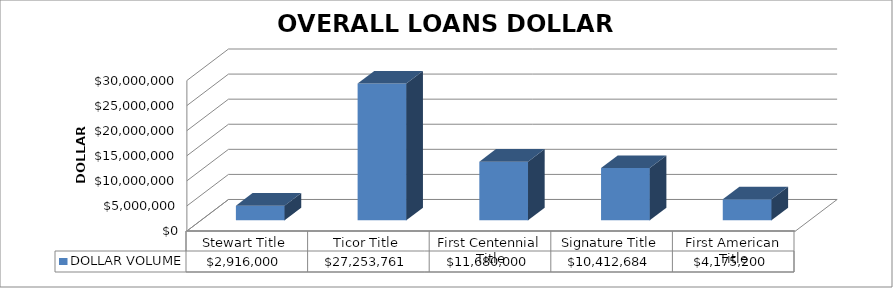
| Category | DOLLAR VOLUME |
|---|---|
| Stewart Title | 2916000 |
| Ticor Title | 27253761 |
| First Centennial Title | 11680000 |
| Signature Title | 10412684 |
| First American Title | 4175200 |